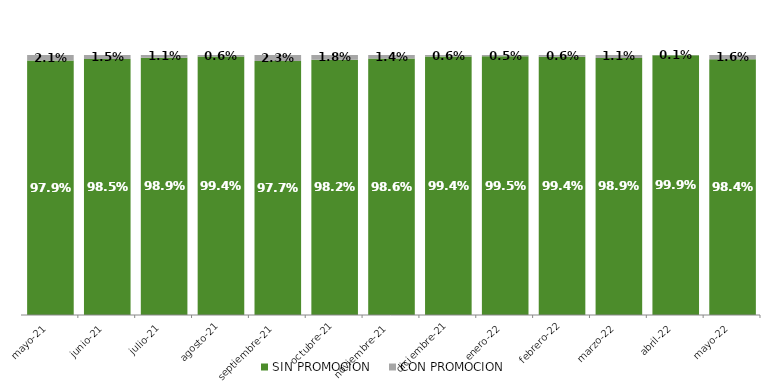
| Category | SIN PROMOCION   | CON PROMOCION   |
|---|---|---|
| 2021-05-01 | 0.979 | 0.021 |
| 2021-06-01 | 0.985 | 0.015 |
| 2021-07-01 | 0.989 | 0.011 |
| 2021-08-01 | 0.994 | 0.006 |
| 2021-09-01 | 0.977 | 0.023 |
| 2021-10-01 | 0.982 | 0.018 |
| 2021-11-01 | 0.986 | 0.014 |
| 2021-12-01 | 0.994 | 0.006 |
| 2022-01-01 | 0.995 | 0.005 |
| 2022-02-01 | 0.994 | 0.006 |
| 2022-03-01 | 0.989 | 0.011 |
| 2022-04-01 | 0.999 | 0.001 |
| 2022-05-01 | 0.984 | 0.016 |